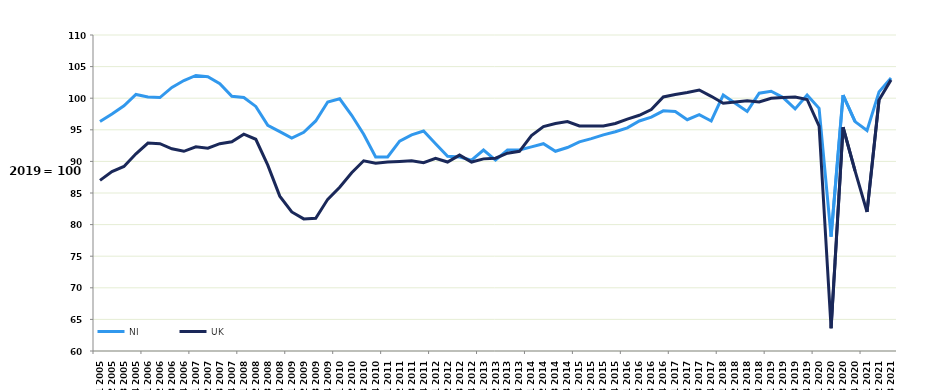
| Category | NI | UK |
|---|---|---|
| Q1 2005 | 96.3 | 87 |
| Q2 2005 | 97.5 | 88.4 |
| Q3 2005 | 98.8 | 89.2 |
| Q4 2005 | 100.6 | 91.2 |
| Q1 2006 | 100.2 | 92.9 |
| Q2 2006 | 100.1 | 92.8 |
| Q3 2006 | 101.7 | 92 |
| Q4 2006 | 102.8 | 91.6 |
| Q1 2007 | 103.6 | 92.3 |
| Q2 2007 | 103.4 | 92.1 |
| Q3 2007 | 102.3 | 92.8 |
| Q4 2007 | 100.3 | 93.1 |
| Q1 2008 | 100.1 | 94.3 |
| Q2 2008 | 98.7 | 93.5 |
| Q3 2008 | 95.7 | 89.4 |
| Q4 2008 | 94.7 | 84.5 |
| Q1 2009 | 93.7 | 82 |
| Q2 2009 | 94.6 | 80.9 |
| Q3 2009 | 96.4 | 81 |
| Q4 2009 | 99.4 | 84 |
| Q1 2010 | 99.9 | 85.9 |
| Q2 2010 | 97.3 | 88.2 |
| Q3 2010 | 94.3 | 90.1 |
| Q4 2010 | 90.7 | 89.7 |
| Q1 2011 | 90.7 | 89.9 |
| Q2 2011 | 93.2 | 90 |
| Q3 2011 | 94.2 | 90.1 |
| Q4 2011 | 94.8 | 89.8 |
| Q1 2012 | 92.8 | 90.5 |
| Q2 2012 | 90.8 | 89.9 |
| Q3 2012 | 90.7 | 91 |
| Q4 2012 | 90.2 | 89.9 |
| Q1 2013 | 91.8 | 90.4 |
| Q2 2013 | 90.2 | 90.5 |
| Q3 2013 | 91.8 | 91.3 |
| Q4 2013 | 91.8 | 91.6 |
| Q1 2014 | 92.3 | 94.1 |
| Q2 2014 | 92.8 | 95.5 |
| Q3 2014 | 91.6 | 96 |
| Q4 2014 | 92.2 | 96.3 |
| Q1 2015 | 93.1 | 95.6 |
| Q2 2015 | 93.6 | 95.6 |
| Q3 2015 | 94.2 | 95.6 |
| Q4 2015 | 94.7 | 96 |
| Q1 2016 | 95.3 | 96.7 |
| Q2 2016 | 96.4 | 97.3 |
| Q3 2016 | 97 | 98.2 |
| Q4 2016 | 98 | 100.2 |
| Q1 2017 | 97.9 | 100.6 |
| Q2 2017 | 96.6 | 100.9 |
| Q3 2017 | 97.4 | 101.3 |
| Q4 2017 | 96.4 | 100.3 |
| Q1 2018 | 100.5 | 99.2 |
| Q2 2018 | 99.2 | 99.4 |
| Q3 2018 | 97.9 | 99.6 |
| Q4 2018 | 100.8 | 99.4 |
| Q1 2019 | 101.1 | 100 |
| Q2 2019 | 100.1 | 100.1 |
| Q3 2019 | 98.3 | 100.2 |
| Q4 2019 | 100.5 | 99.8 |
| Q1 2020 | 98.4 | 95.6 |
| Q2 2020 | 78.1 | 63.6 |
| Q3 2020 | 100.5 | 95.4 |
| Q4 2020 | 96.3 | 88.5 |
| Q1 2021 | 94.9 | 82 |
| Q2 2021 | 101 | 99.7 |
| Q3 2021 | 103.2 | 102.9 |